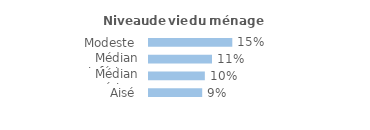
| Category | Series 0 |
|---|---|
| Modeste | 0.145 |
| Médian inférieur | 0.11 |
| Médian supérieur | 0.097 |
| Aisé | 0.093 |